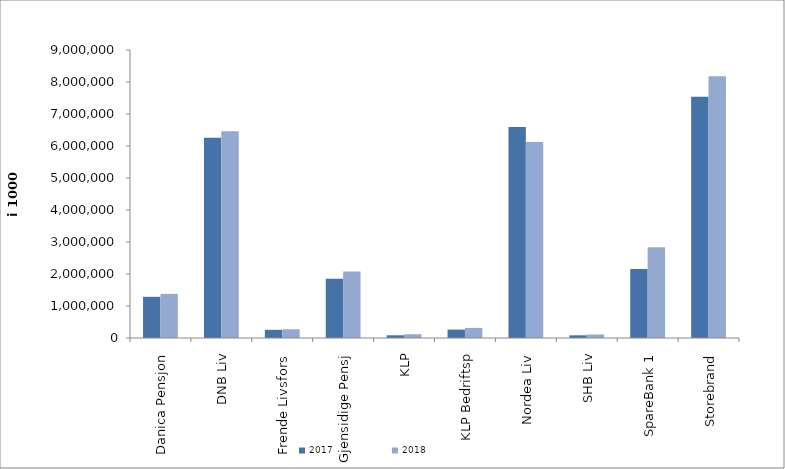
| Category | 2017 | 2018 |
|---|---|---|
| Danica Pensjon | 1286598.712 | 1378607.102 |
| DNB Liv | 6258891 | 6459699 |
| Frende Livsfors | 255316 | 272300 |
| Gjensidige Pensj | 1851333.284 | 2075074 |
| KLP | 84881.887 | 116827.63 |
| KLP Bedriftsp | 262322 | 315306 |
| Nordea Liv | 6592823.675 | 6126379.012 |
| SHB Liv | 84302 | 108843 |
| SpareBank 1 | 2157471.793 | 2837915.873 |
| Storebrand | 7537662.621 | 8177309.654 |